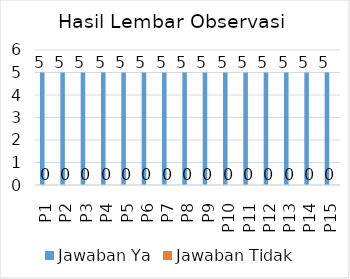
| Category | Jawaban Ya | Jawaban Tidak  |
|---|---|---|
| P1 | 5 | 0 |
| P2 | 5 | 0 |
| P3 | 5 | 0 |
| P4 | 5 | 0 |
| P5 | 5 | 0 |
| P6 | 5 | 0 |
| P7 | 5 | 0 |
| P8 | 5 | 0 |
| P9 | 5 | 0 |
| P10 | 5 | 0 |
| P11 | 5 | 0 |
| P12 | 5 | 0 |
| P13 | 5 | 0 |
| P14 | 5 | 0 |
| P15 | 5 | 0 |